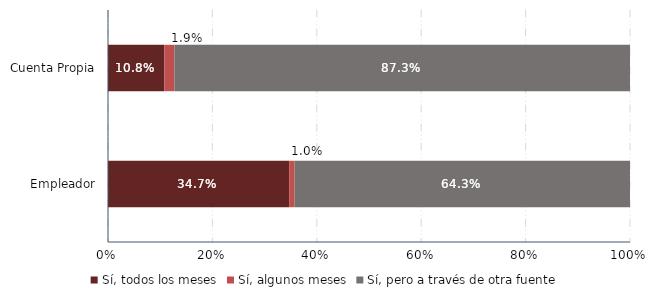
| Category | Sí, todos los meses | Sí, algunos meses | Sí, pero a través de otra fuente |
|---|---|---|---|
| Empleador | 0.347 | 0.01 | 0.642 |
| Cuenta Propia | 0.108 | 0.019 | 0.873 |